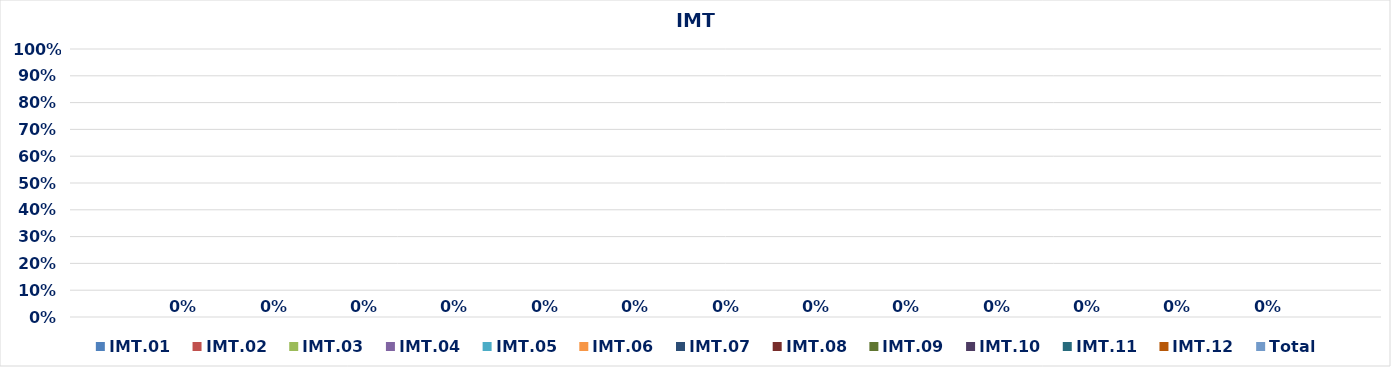
| Category | IMT.01 | IMT.02 | IMT.03 | IMT.04 | IMT.05 | IMT.06 | IMT.07 | IMT.08 | IMT.09 | IMT.10 | IMT.11 | IMT.12 | Total |
|---|---|---|---|---|---|---|---|---|---|---|---|---|---|
| 0 | 0 | 0 | 0 | 0 | 0 | 0 | 0 | 0 | 0 | 0 | 0 | 0 | 0 |